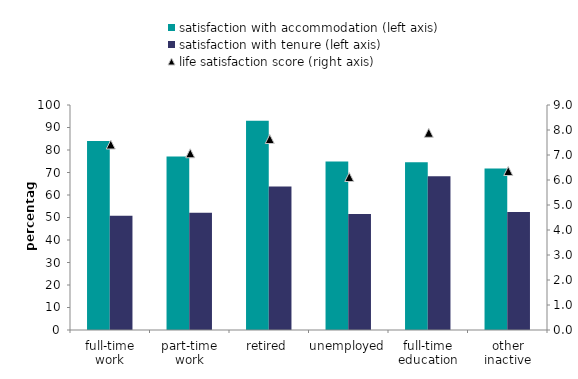
| Category | satisfaction with accommodation (left axis) | satisfaction with tenure (left axis) |
|---|---|---|
| full-time work | 84 | 50.8 |
| part-time work | 77.1 | 52.1 |
| retired | 93 | 63.8 |
| unemployed | 74.9 | 51.6 |
| full-time education | 74.6 | 68.3 |
| other inactive | 71.8 | 52.5 |